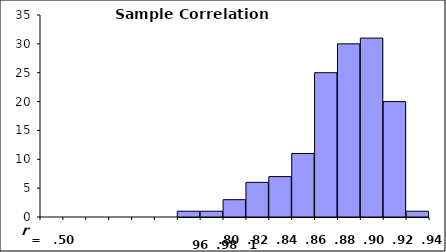
| Category | Series 0 |
|---|---|
| 0 | 0 |
| 1 | 0 |
| 2 | 0 |
| 3 | 0 |
| 4 | 0 |
| 5 | 0 |
| 6 | 1 |
| 7 | 1 |
| 8 | 3 |
| 9 | 6 |
| 10 | 7 |
| 11 | 11 |
| 12 | 25 |
| 13 | 30 |
| 14 | 31 |
| 15 | 20 |
| 16 | 1 |